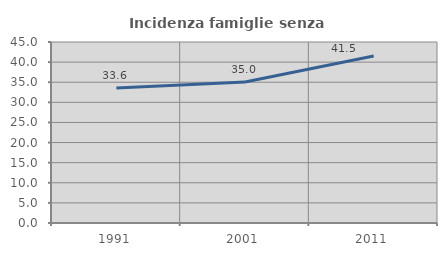
| Category | Incidenza famiglie senza nuclei |
|---|---|
| 1991.0 | 33.574 |
| 2001.0 | 35.046 |
| 2011.0 | 41.528 |